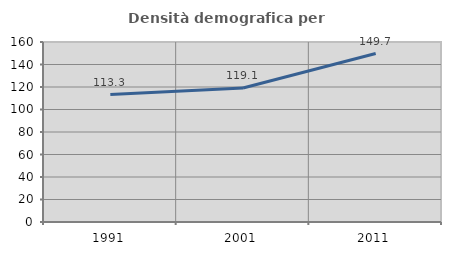
| Category | Densità demografica |
|---|---|
| 1991.0 | 113.31 |
| 2001.0 | 119.125 |
| 2011.0 | 149.74 |